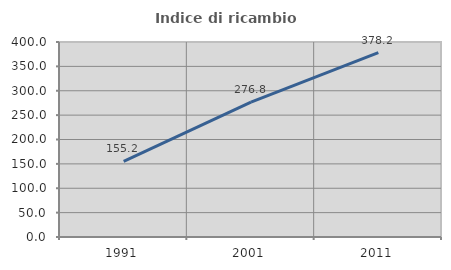
| Category | Indice di ricambio occupazionale  |
|---|---|
| 1991.0 | 155.19 |
| 2001.0 | 276.842 |
| 2011.0 | 378.198 |